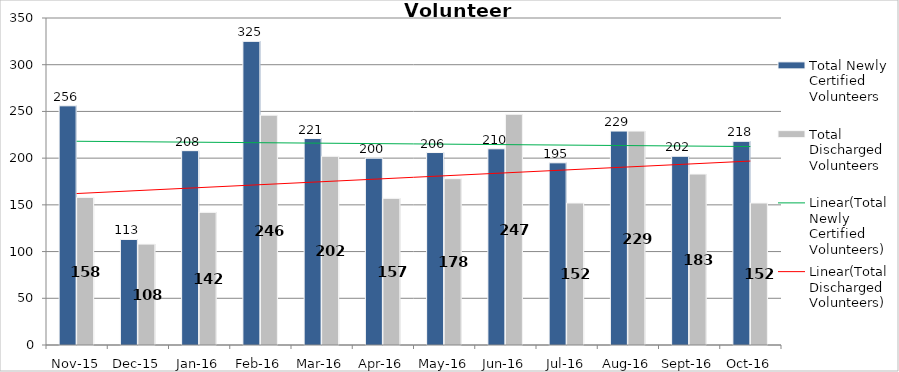
| Category | Total Newly Certified Volunteers | Total Discharged Volunteers |
|---|---|---|
| Nov-15 | 256 | 158 |
| Dec-15 | 113 | 108 |
| Jan-16 | 208 | 142 |
| Feb-16 | 325 | 246 |
| Mar-16 | 221 | 202 |
| Apr-16 | 200 | 157 |
| May-16 | 206 | 178 |
| Jun-16 | 210 | 247 |
| Jul-16 | 195 | 152 |
| Aug-16 | 229 | 229 |
| Sep-16 | 202 | 183 |
| Oct-16 | 218 | 152 |